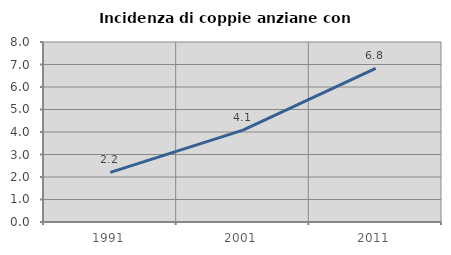
| Category | Incidenza di coppie anziane con figli |
|---|---|
| 1991.0 | 2.206 |
| 2001.0 | 4.082 |
| 2011.0 | 6.831 |